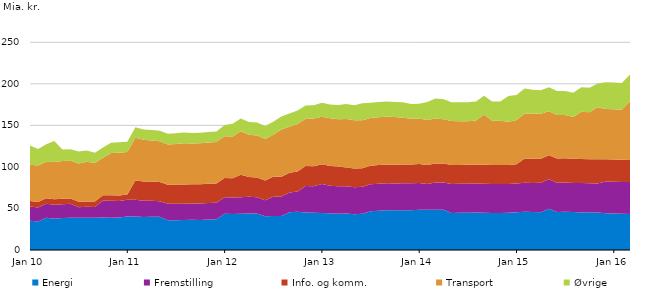
| Category | Energi | Fremstilling | Info. og komm. | Transport | Øvrige |
|---|---|---|---|---|---|
| 2010-01-01 | 35.1 | 17.3 | 6.5 | 43.6 | 23.4 |
| 2010-02-01 | 34.3 | 17 | 6.5 | 43.8 | 19.9 |
| 2010-03-01 | 38.9 | 16.9 | 6.5 | 44 | 21 |
| 2010-04-01 | 37.7 | 16.9 | 6.5 | 44.9 | 25.2 |
| 2010-05-01 | 38.5 | 16.7 | 6.5 | 45.3 | 14 |
| 2010-06-01 | 38.8 | 16.8 | 6.5 | 45.3 | 14 |
| 2010-07-01 | 38.7 | 12.8 | 6.5 | 46 | 14.5 |
| 2010-08-01 | 38.9 | 13.1 | 6.5 | 47.7 | 13.7 |
| 2010-09-01 | 38.7 | 13.2 | 6.5 | 46.4 | 12.3 |
| 2010-10-01 | 39 | 20.5 | 6.5 | 45 | 12.3 |
| 2010-11-01 | 38.9 | 20.4 | 6.5 | 51 | 12.3 |
| 2010-12-01 | 39 | 20.1 | 6.5 | 51.6 | 12.5 |
| 2011-01-01 | 40.4 | 20 | 6.5 | 51 | 12.5 |
| 2011-02-01 | 40.3 | 20.1 | 23.3 | 51.5 | 12.5 |
| 2011-03-01 | 39.8 | 19.6 | 23.1 | 50.1 | 12.5 |
| 2011-04-01 | 39.9 | 19.5 | 23.1 | 49.4 | 12.5 |
| 2011-05-01 | 40 | 18.7 | 23.2 | 49.1 | 12.5 |
| 2011-06-01 | 35.9 | 19.7 | 23 | 48.5 | 12.7 |
| 2011-07-01 | 35.8 | 19.8 | 23.1 | 48.9 | 12.8 |
| 2011-08-01 | 36.1 | 19.7 | 23.1 | 49.6 | 12.8 |
| 2011-09-01 | 36.3 | 19.8 | 23.1 | 49.1 | 12.6 |
| 2011-10-01 | 36.2 | 19.8 | 23.1 | 49.5 | 12.5 |
| 2011-11-01 | 36.7 | 19.8 | 23.2 | 49.7 | 12.5 |
| 2011-12-01 | 36.9 | 19.9 | 23.3 | 50 | 12.4 |
| 2012-01-01 | 43.6 | 19.9 | 23.3 | 50.2 | 13.5 |
| 2012-02-01 | 43.3 | 19.9 | 23.3 | 50 | 15.4 |
| 2012-03-01 | 43.5 | 19.9 | 27.1 | 52.4 | 15.3 |
| 2012-04-01 | 44 | 20 | 23.8 | 50.8 | 15.4 |
| 2012-05-01 | 44 | 19.4 | 23.9 | 50.4 | 15.7 |
| 2012-06-01 | 40.5 | 19.4 | 23.8 | 50 | 15.7 |
| 2012-07-01 | 40.8 | 23.3 | 24 | 50.5 | 15.9 |
| 2012-08-01 | 41 | 23.3 | 24 | 56.6 | 15.8 |
| 2012-09-01 | 45.5 | 23.6 | 24 | 55.3 | 15.8 |
| 2012-10-01 | 46 | 24.5 | 23.9 | 57.4 | 16.1 |
| 2012-11-01 | 45 | 32.1 | 23.9 | 56.9 | 16 |
| 2012-12-01 | 44.8 | 32 | 23.9 | 57.6 | 15.9 |
| 2013-01-01 | 44.5 | 35 | 23.6 | 57.2 | 16.8 |
| 2013-02-01 | 44.3 | 33.1 | 23.6 | 57.6 | 16.6 |
| 2013-03-01 | 43.6 | 33.2 | 23.7 | 56.9 | 17.2 |
| 2013-04-01 | 44 | 32.6 | 22.6 | 58.5 | 18.1 |
| 2013-05-01 | 43.1 | 32.5 | 22.5 | 58 | 18.2 |
| 2013-06-01 | 43.7 | 32.3 | 22.5 | 57.8 | 20.2 |
| 2013-07-01 | 46.7 | 32.3 | 22.4 | 57.4 | 18.5 |
| 2013-08-01 | 47.3 | 32.4 | 22.5 | 57.7 | 18.1 |
| 2013-09-01 | 47.8 | 32.5 | 22.6 | 57.7 | 18.1 |
| 2013-10-01 | 47.7 | 32.3 | 22.5 | 57.5 | 18 |
| 2013-11-01 | 47.9 | 32.4 | 22.6 | 56.2 | 18.8 |
| 2013-12-01 | 47.8 | 32.4 | 22.6 | 55.3 | 17.7 |
| 2014-01-01 | 48.4 | 32.3 | 22.7 | 54.9 | 17.6 |
| 2014-02-01 | 48.4 | 31.1 | 22.7 | 54.3 | 21.7 |
| 2014-03-01 | 48.5 | 32.9 | 22.7 | 54.2 | 24.1 |
| 2014-04-01 | 48.5 | 32.8 | 22.7 | 53.4 | 24.1 |
| 2014-05-01 | 44.6 | 34.8 | 22.8 | 53.1 | 22.5 |
| 2014-06-01 | 44.9 | 34.7 | 22.8 | 52.7 | 22.7 |
| 2014-07-01 | 44.9 | 34.8 | 22.9 | 52.3 | 22.8 |
| 2014-08-01 | 45.2 | 34.9 | 22.8 | 52.9 | 22.9 |
| 2014-09-01 | 44.8 | 35 | 22.9 | 60.1 | 22.9 |
| 2014-10-01 | 44.6 | 34.9 | 22.9 | 53.3 | 22.9 |
| 2014-11-01 | 44.6 | 34.9 | 22.8 | 53.4 | 22.9 |
| 2014-12-01 | 44.7 | 34.7 | 22.9 | 52 | 31 |
| 2015-01-01 | 45.3 | 34.8 | 23.1 | 53.2 | 30.1 |
| 2015-02-01 | 46 | 35 | 29 | 53.9 | 30.5 |
| 2015-03-01 | 45.6 | 35.1 | 29 | 54.5 | 28.7 |
| 2015-04-01 | 45.5 | 35.3 | 29 | 54.1 | 28.3 |
| 2015-05-01 | 49.8 | 35.3 | 29 | 53 | 28.7 |
| 2015-06-01 | 45.6 | 35.3 | 29.1 | 52.4 | 29 |
| 2015-07-01 | 46 | 35.2 | 29.1 | 52.2 | 29 |
| 2015-08-01 | 45.6 | 35.1 | 29 | 50.5 | 29 |
| 2015-09-01 | 45.2 | 35.3 | 28.9 | 57.1 | 29.3 |
| 2015-10-01 | 45.4 | 34.9 | 29 | 56.6 | 29.3 |
| 2015-11-01 | 45.2 | 34.9 | 29.1 | 62.7 | 28.6 |
| 2015-12-01 | 44.3 | 38.2 | 26.8 | 60.5 | 32.2 |
| 2016-01-01 | 43.9 | 38.4 | 26.6 | 60.6 | 32.2 |
| 2016-02-01 | 43.5 | 38.5 | 26.5 | 60.2 | 32.3 |
| 2016-03-01 | 43.4 | 38.5 | 26.4 | 70.8 | 32.3 |